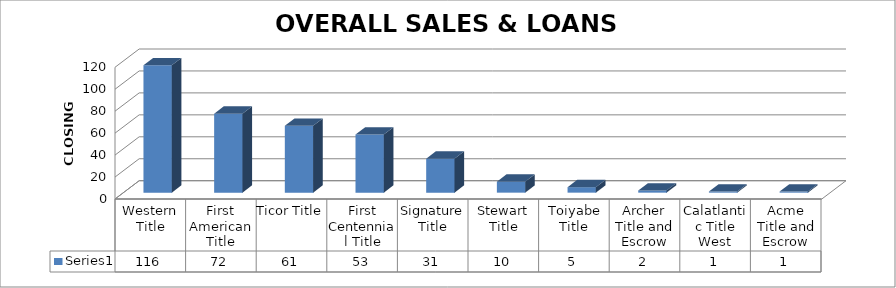
| Category | Series 0 |
|---|---|
| Western Title | 116 |
| First American Title | 72 |
| Ticor Title | 61 |
| First Centennial Title | 53 |
| Signature Title | 31 |
| Stewart Title | 10 |
| Toiyabe Title | 5 |
| Archer Title and Escrow | 2 |
| Calatlantic Title West | 1 |
| Acme Title and Escrow | 1 |